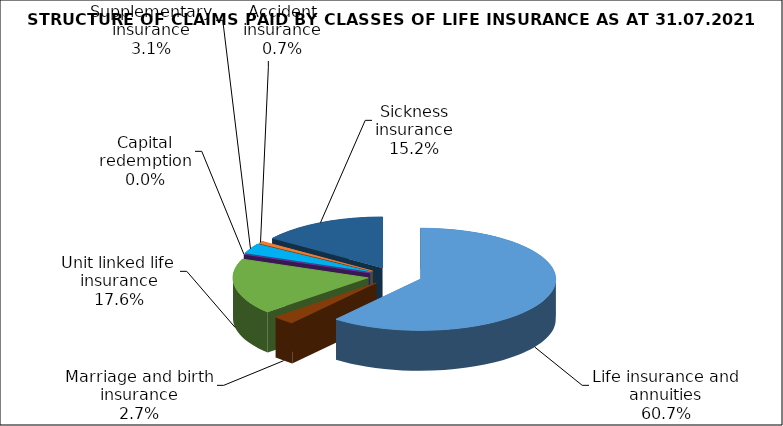
| Category | Series 0 |
|---|---|
| Life insurance and annuities | 78739141.329 |
| Marriage and birth insurance | 3448057.774 |
| Unit linked life insurance | 22881077.952 |
| Capital redemption | 0 |
| Supplementary insurance | 4080808.685 |
| Accident insurance | 932896.916 |
| Sickness insurance | 19670524.435 |